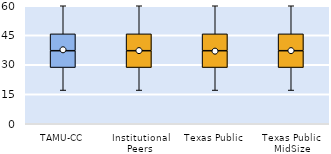
| Category | 25th | 50th | 75th |
|---|---|---|---|
| TAMU-CC | 28.571 | 8.571 | 8.571 |
| Institutional Peers | 28.571 | 8.571 | 8.571 |
| Texas Public | 28.571 | 8.571 | 8.571 |
| Texas Public MidSize | 28.571 | 8.571 | 8.571 |